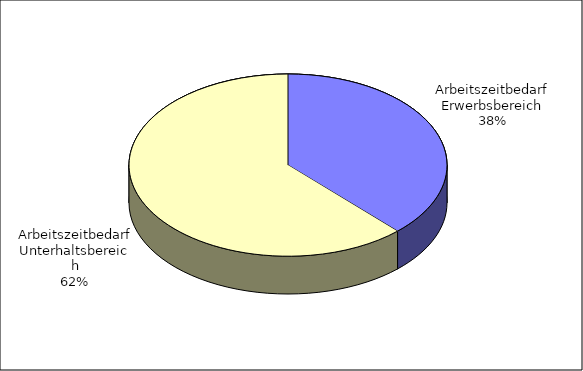
| Category | Series 0 |
|---|---|
| Arbeitszeitbedarf Erwerbsbereich | 3876 |
| Arbeitszeitbedarf Unterhaltsbereich | 6350 |